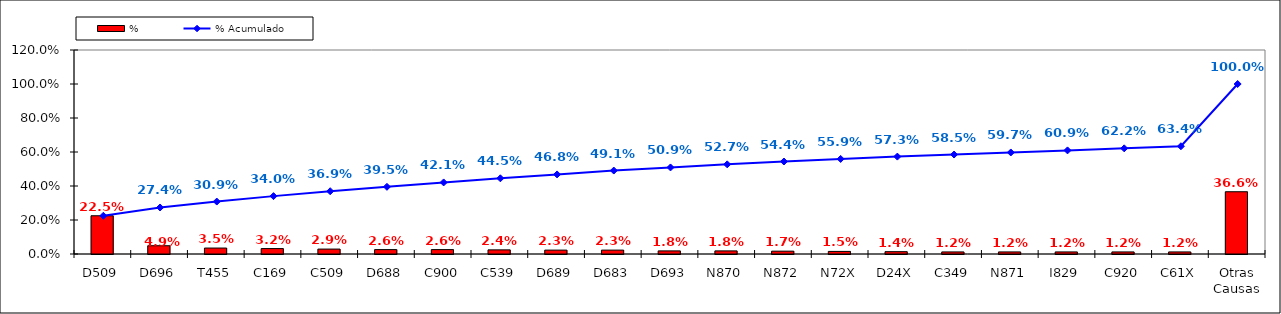
| Category | % |
|---|---|
| D509 | 0.225 |
| D696 | 0.049 |
| T455 | 0.035 |
| C169 | 0.032 |
| C509 | 0.029 |
| D688 | 0.026 |
| C900 | 0.026 |
| C539 | 0.024 |
| D689 | 0.023 |
| D683 | 0.023 |
| D693 | 0.018 |
| N870 | 0.018 |
| N872 | 0.017 |
| N72X | 0.015 |
| D24X | 0.014 |
| C349 | 0.012 |
| N871 | 0.012 |
| I829 | 0.012 |
| C920 | 0.012 |
| C61X | 0.012 |
| Otras Causas | 0.366 |